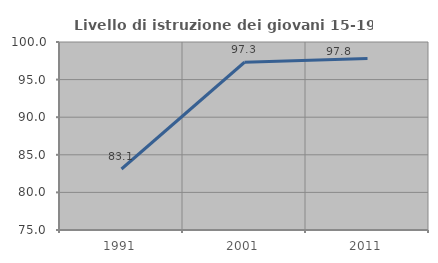
| Category | Livello di istruzione dei giovani 15-19 anni |
|---|---|
| 1991.0 | 83.112 |
| 2001.0 | 97.307 |
| 2011.0 | 97.802 |